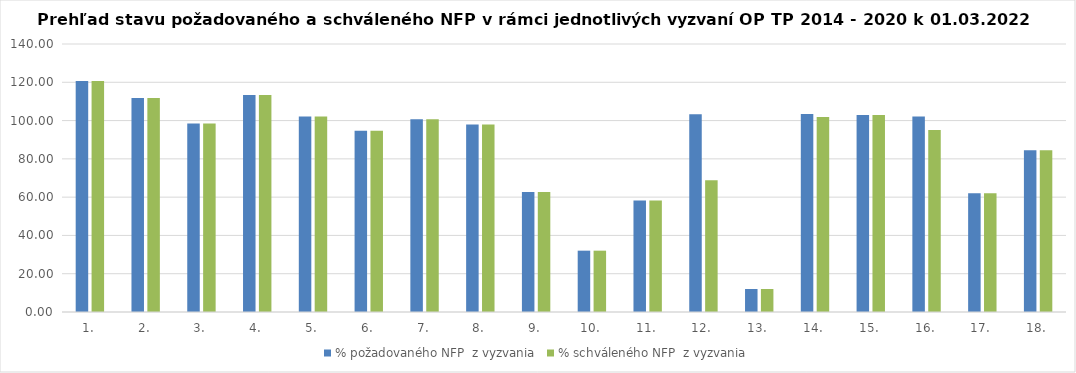
| Category | % požadovaného NFP  z vyzvania | % schváleného NFP  z vyzvania |
|---|---|---|
| 1. | 120.662 | 120.662 |
| 2. | 111.83 | 111.83 |
| 3. | 98.465 | 98.465 |
| 4. | 113.295 | 113.295 |
| 5. | 102.19 | 102.19 |
| 6. | 94.643 | 94.643 |
| 7. | 100.637 | 100.637 |
| 8. | 97.989 | 97.989 |
| 9. | 62.721 | 62.721 |
| 10. | 32.038 | 32.038 |
| 11. | 58.283 | 58.283 |
| 12. | 103.242 | 68.88 |
| 13. | 12.008 | 12.008 |
| 14. | 103.392 | 101.839 |
| 15. | 102.872 | 102.872 |
| 16. | 102.176 | 95.126 |
| 17. | 61.969 | 61.969 |
| 18. | 84.514 | 84.514 |